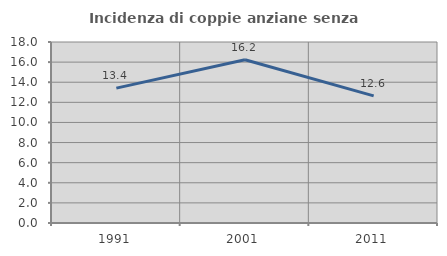
| Category | Incidenza di coppie anziane senza figli  |
|---|---|
| 1991.0 | 13.412 |
| 2001.0 | 16.232 |
| 2011.0 | 12.641 |